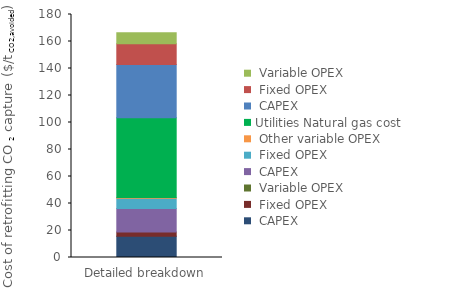
| Category | Interconnecting | Utilities | Series 0 | Series 1 | Series 2 |
|---|---|---|---|---|---|
| 0 | 0 | 59.153 | 39.408 | 15.288 | 8.234 |